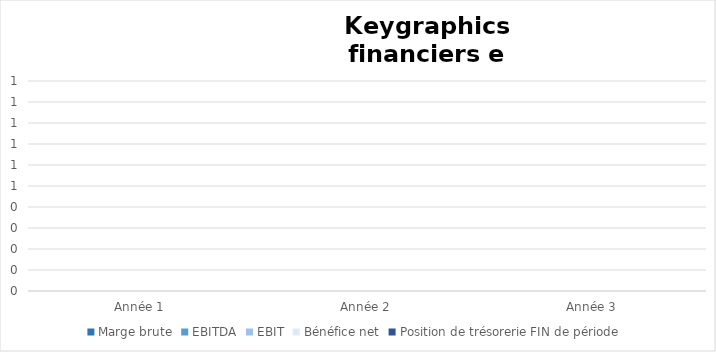
| Category | Marge brute | EBITDA | EBIT | Bénéfice net | Position de trésorerie FIN de période  |
|---|---|---|---|---|---|
| Année 1 | 0 | 0 | 0 | 0 | 0 |
| Année 2 | 0 | 0 | 0 | 0 | 0 |
| Année 3 | 0 | 0 | 0 | 0 | 0 |